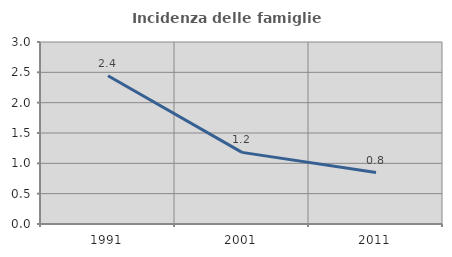
| Category | Incidenza delle famiglie numerose |
|---|---|
| 1991.0 | 2.443 |
| 2001.0 | 1.181 |
| 2011.0 | 0.848 |